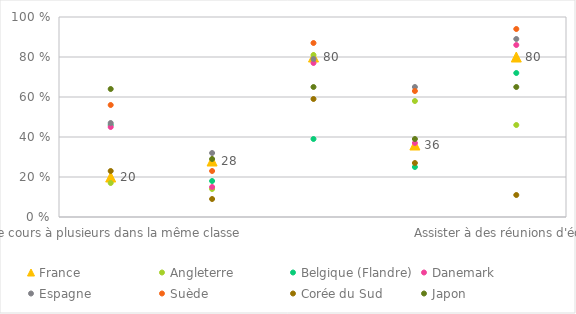
| Category | France | Angleterre | Belgique (Flandre) | Danemark | Espagne | Suède | Corée du Sud | Japon |
|---|---|---|---|---|---|---|---|---|
| Faire cours à plusieurs dans la même classe | 0.2 | 0.17 | 0.46 | 0.45 | 0.47 | 0.56 | 0.23 | 0.64 |
| Participer à des activités organisées collectivement pour plusieurs classes et groupes d’âge  | 0.28 | 0.14 | 0.18 | 0.15 | 0.32 | 0.23 | 0.09 | 0.29 |
| Discuter des progrès faits par certains élèves  | 0.8 | 0.81 | 0.39 | 0.77 | 0.79 | 0.87 | 0.59 | 0.65 |
| Collaborer pour appliquer des barèmes communs pour évaluer les progrès des élèves  | 0.36 | 0.58 | 0.25 | 0.37 | 0.65 | 0.63 | 0.27 | 0.39 |
| Assister à des réunions d'équipe  | 0.8 | 0.46 | 0.72 | 0.86 | 0.89 | 0.94 | 0.11 | 0.65 |